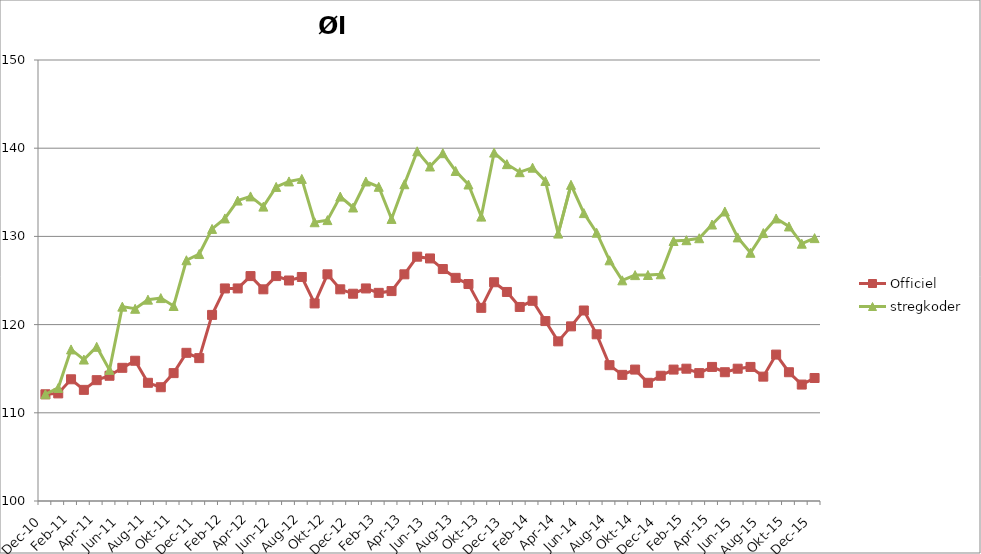
| Category | Officiel | stregkoder |
|---|---|---|
|  Dec-10 | 112.1 | 112.104 |
|  Jan-11 | 112.2 | 112.818 |
|  Feb-11 | 113.8 | 117.186 |
|  Mar-11 | 112.6 | 116.037 |
|  Apr-11 | 113.7 | 117.48 |
|  Maj-11 | 114.2 | 114.868 |
|  Jun-11 | 115.1 | 122.038 |
|  Jul-11 | 115.9 | 121.793 |
|  Aug-11 | 113.4 | 122.828 |
|  Sep-11 | 112.9 | 123.006 |
|  Okt-11 | 114.5 | 122.108 |
|  Nov-11 | 116.8 | 127.295 |
|  Dec-11 | 116.2 | 128.001 |
|  Jan-12 | 121.1 | 130.846 |
|  Feb-12 | 124.1 | 132.035 |
|  Mar-12 | 124.1 | 134.061 |
|  Apr-12 | 125.5 | 134.534 |
|  Maj-12 | 124 | 133.376 |
|  Jun-12 | 125.5 | 135.61 |
|  Jul-12 | 125 | 136.232 |
|  Aug-12 | 125.4 | 136.519 |
|  Sep-12 | 122.4 | 131.605 |
|  Okt-12 | 125.7 | 131.847 |
|  Nov-12 | 124 | 134.516 |
|  Dec-12 | 123.5 | 133.276 |
|  Jan-13 | 124.1 | 136.225 |
|  Feb-13 | 123.6 | 135.623 |
|  Mar-13 | 123.8 | 131.981 |
|  Apr-13 | 125.7 | 135.913 |
|  Maj-13 | 127.7 | 139.648 |
|  Jun-13 | 127.5 | 137.925 |
|  Jul-13 | 126.3 | 139.436 |
|  Aug-13 | 125.3 | 137.417 |
|  Sep-13 | 124.6 | 135.883 |
|  Okt-13 | 121.9 | 132.243 |
|  Nov-13 | 124.8 | 139.502 |
|  Dec-13 | 123.7 | 138.192 |
|  Jan-14 | 122 | 137.279 |
|  Feb-14 | 122.7 | 137.792 |
|  Mar-14 | 120.4 | 136.286 |
|  Apr-14 | 118.1 | 130.319 |
|  Maj-14 | 119.8 | 135.85 |
|  Jun-14 | 121.6 | 132.642 |
|  Jul-14 | 118.9 | 130.417 |
|  Aug-14 | 115.4 | 127.288 |
|  Sep-14 | 114.3 | 125.019 |
|  Okt-14 | 114.9 | 125.611 |
|  Nov-14 | 113.4 | 125.623 |
|  Dec-14 | 114.2 | 125.706 |
|  Jan-15 | 114.9 | 129.48 |
|  Feb-15 | 115 | 129.567 |
|  Mar-15 | 114.5 | 129.791 |
|  Apr-15 | 115.2 | 131.347 |
|  Maj-15 | 114.6 | 132.823 |
| Jun-15 | 115 | 129.885 |
| Jul-15 | 115.2 | 128.145 |
| Aug-15 | 114.1 | 130.379 |
| Sep-15 | 116.6 | 132.033 |
| Okt-15 | 114.6 | 131.128 |
| Nov-15 | 113.2 | 129.173 |
| Dec-15 | 113.946 | 129.805 |